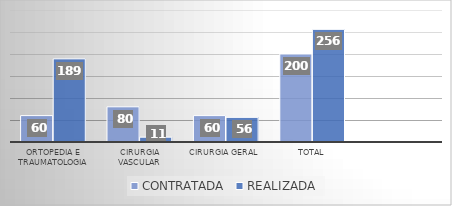
| Category | CONTRATADA | REALIZADA |
|---|---|---|
| Ortopedia e traumatologia | 60 | 189 |
| Cirurgia vascular | 80 | 11 |
| Cirurgia Geral | 60 | 56 |
| TOTAL | 200 | 256 |